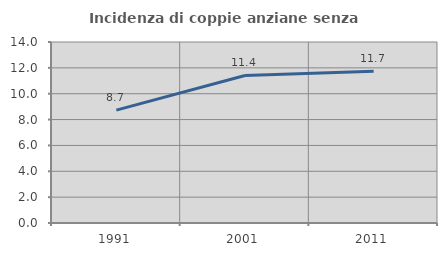
| Category | Incidenza di coppie anziane senza figli  |
|---|---|
| 1991.0 | 8.732 |
| 2001.0 | 11.41 |
| 2011.0 | 11.739 |